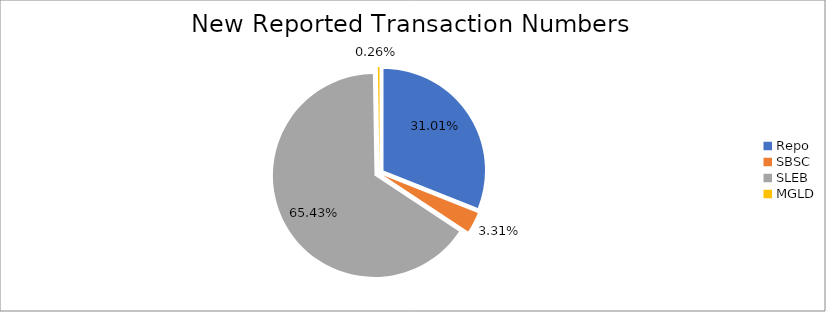
| Category | Series 0 |
|---|---|
| Repo | 417368 |
| SBSC | 44545 |
| SLEB | 880701 |
| MGLD | 3449 |